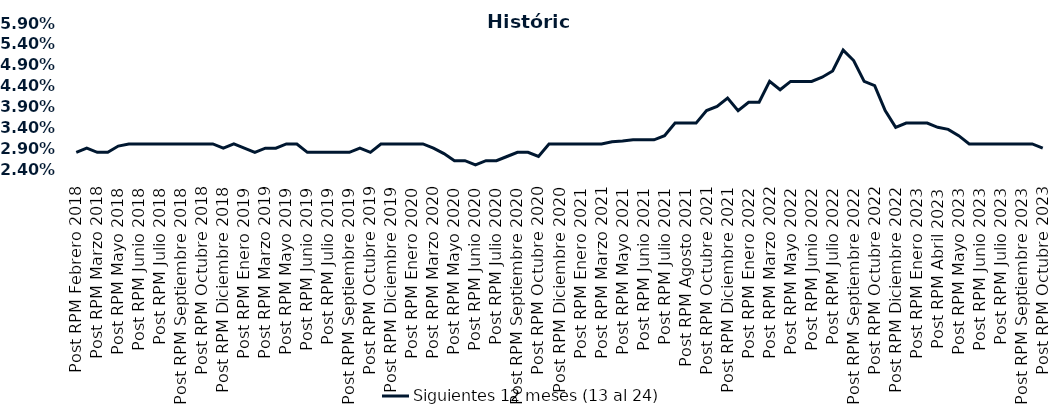
| Category | Siguientes 12 meses (13 al 24)  |
|---|---|
| Post RPM Febrero 2018 | 0.028 |
| Pre RPM Marzo 2018 | 0.029 |
| Post RPM Marzo 2018 | 0.028 |
| Pre RPM Mayo 2018 | 0.028 |
| Post RPM Mayo 2018 | 0.03 |
| Pre RPM Junio 2018 | 0.03 |
| Post RPM Junio 2018 | 0.03 |
| Pre RPM Julio 2018 | 0.03 |
| Post RPM Julio 2018 | 0.03 |
| Pre RPM Septiembre 2018 | 0.03 |
| Post RPM Septiembre 2018 | 0.03 |
| Pre RPM Octubre 2018 | 0.03 |
| Post RPM Octubre 2018 | 0.03 |
| Pre RPM Diciembre 2018 | 0.03 |
| Post RPM Diciembre 2018 | 0.029 |
| Pre RPM Enero 2019 | 0.03 |
| Post RPM Enero 2019 | 0.029 |
| Pre RPM Marzo 2019 | 0.028 |
| Post RPM Marzo 2019 | 0.029 |
| Pre RPM Mayo 2019 | 0.029 |
| Post RPM Mayo 2019 | 0.03 |
| Pre RPM Junio 2019 | 0.03 |
| Post RPM Junio 2019 | 0.028 |
| Pre RPM Julio 2019 | 0.028 |
| Post RPM Julio 2019 | 0.028 |
| Pre RPM Septiembre 2019 | 0.028 |
| Post RPM Septiembre 2019 | 0.028 |
| Pre RPM Octubre 2019 | 0.029 |
| Post RPM Octubre 2019 | 0.028 |
| Pre RPM Diciembre 2019 | 0.03 |
| Post RPM Diciembre 2019 | 0.03 |
| Pre RPM Enero 2020 | 0.03 |
| Post RPM Enero 2020 | 0.03 |
| Pre RPM Marzo 2020 | 0.03 |
| Post RPM Marzo 2020 | 0.029 |
| Pre RPM Mayo 2020 | 0.028 |
| Post RPM Mayo 2020 | 0.026 |
| Pre RPM Junio 2020 | 0.026 |
| Post RPM Junio 2020 | 0.025 |
| Pre RPM Julio 2020 | 0.026 |
| Post RPM Julio 2020 | 0.026 |
| Pre RPM Septiembre 2020 | 0.027 |
| Post RPM Septiembre 2020 | 0.028 |
| Pre RPM Octubre 2020 | 0.028 |
| Post RPM Octubre 2020 | 0.027 |
| Pre RPM Diciembre 2020 | 0.03 |
| Post RPM Diciembre 2020 | 0.03 |
| Pre RPM Enero 2021 | 0.03 |
| Post RPM Enero 2021 | 0.03 |
| Pre RPM Marzo 2021 | 0.03 |
| Post RPM Marzo 2021 | 0.03 |
| Pre RPM Mayo 2021 | 0.031 |
| Post RPM Mayo 2021 | 0.031 |
| Pre RPM Junio 2021 | 0.031 |
| Post RPM Junio 2021 | 0.031 |
| Pre RPM Julio 2021 | 0.031 |
| Post RPM Julio 2021 | 0.032 |
| Pre RPM Agosto 2021 | 0.035 |
| Post RPM Agosto 2021 | 0.035 |
| Pre RPM Octubre 2021 | 0.035 |
| Post RPM Octubre 2021 | 0.038 |
| Pre RPM Diciembre 2021 | 0.039 |
| Post RPM Diciembre 2021 | 0.041 |
| Pre RPM Enero 2022 | 0.038 |
| Post RPM Enero 2022 | 0.04 |
| Pre RPM Marzo 2022 | 0.04 |
| Post RPM Marzo 2022 | 0.045 |
| Pre RPM Mayo 2022 | 0.043 |
| Post RPM Mayo 2022 | 0.045 |
| Pre RPM Junio 2022 | 0.045 |
| Post RPM Junio 2022 | 0.045 |
| Pre RPM Julio 2022 | 0.046 |
| Post RPM Julio 2022 | 0.048 |
| Pre RPM Septiembre 2022 | 0.052 |
| Post RPM Septiembre 2022 | 0.05 |
| Pre RPM Octubre 2022 | 0.045 |
| Post RPM Octubre 2022 | 0.044 |
| Pre RPM Diciembre 2022 | 0.038 |
| Post RPM Diciembre 2022 | 0.034 |
| Pre RPM Enero 2023 | 0.035 |
| Post RPM Enero 2023 | 0.035 |
| Pre RPM Abril 2023 | 0.035 |
| Post RPM Abril 2023 | 0.034 |
| Pre RPM Mayo 2023 | 0.034 |
| Post RPM Mayo 2023 | 0.032 |
| Pre RPM Junio 2023 | 0.03 |
| Post RPM Junio 2023 | 0.03 |
| Pre RPM Julio 2023 | 0.03 |
| Post RPM Julio 2023 | 0.03 |
| Pre RPM Septiembre 2023 | 0.03 |
| Post RPM Septiembre 2023 | 0.03 |
| Pre RPM Octubre 2023 | 0.03 |
| Post RPM Octubre 2023 | 0.029 |